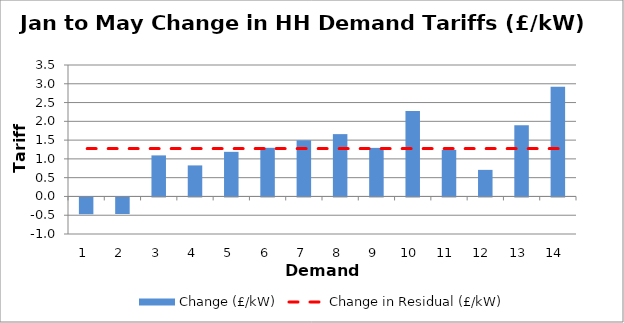
| Category | Change (£/kW) |
|---|---|
| 1.0 | -0.447 |
| 2.0 | -0.441 |
| 3.0 | 1.093 |
| 4.0 | 0.826 |
| 5.0 | 1.188 |
| 6.0 | 1.295 |
| 7.0 | 1.495 |
| 8.0 | 1.659 |
| 9.0 | 1.293 |
| 10.0 | 2.274 |
| 11.0 | 1.241 |
| 12.0 | 0.708 |
| 13.0 | 1.894 |
| 14.0 | 2.922 |